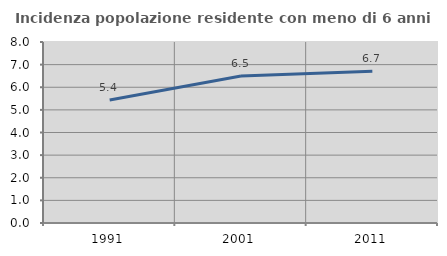
| Category | Incidenza popolazione residente con meno di 6 anni |
|---|---|
| 1991.0 | 5.436 |
| 2001.0 | 6.495 |
| 2011.0 | 6.709 |